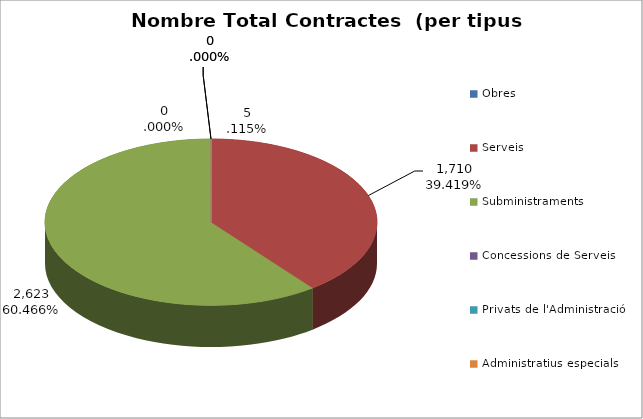
| Category | Nombre Total Contractes |
|---|---|
| Obres | 5 |
| Serveis | 1710 |
| Subministraments | 2623 |
| Concessions de Serveis | 0 |
| Privats de l'Administració | 0 |
| Administratius especials | 0 |